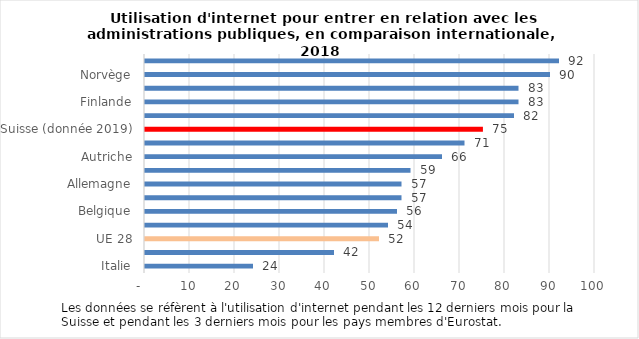
| Category | Series 0 |
|---|---|
| Italie | 24 |
| Portugal | 42 |
| UE 28 | 52 |
| Irlande | 54 |
| Belgique | 56 |
| Espagne | 57 |
| Allemagne | 57 |
| Royaume-Uni | 59 |
| Autriche | 66 |
| France | 71 |
| Suisse (donnée 2019) | 75.093 |
| Pays-Bas | 82 |
| Finlande | 83 |
| Suède | 83 |
| Norvège | 90 |
| Danemark | 92 |